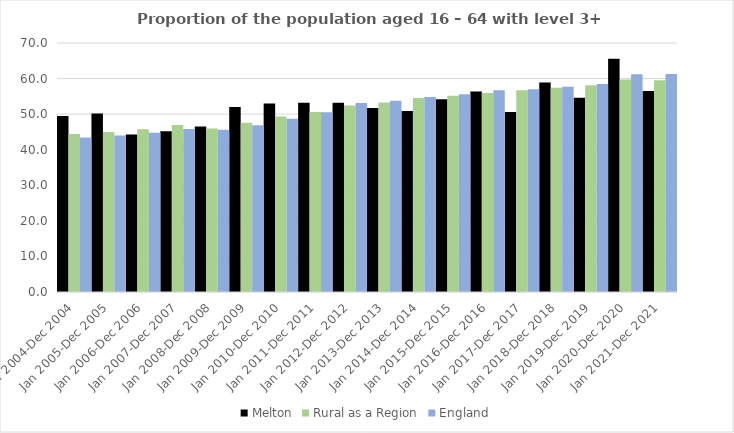
| Category | Melton | Rural as a Region | England |
|---|---|---|---|
| Jan 2004-Dec 2004 | 49.5 | 44.405 | 43.4 |
| Jan 2005-Dec 2005 | 50.2 | 44.973 | 44 |
| Jan 2006-Dec 2006 | 44.3 | 45.774 | 44.8 |
| Jan 2007-Dec 2007 | 45.2 | 46.968 | 45.8 |
| Jan 2008-Dec 2008 | 46.5 | 45.964 | 45.6 |
| Jan 2009-Dec 2009 | 52 | 47.59 | 46.9 |
| Jan 2010-Dec 2010 | 53 | 49.362 | 48.7 |
| Jan 2011-Dec 2011 | 53.2 | 50.602 | 50.5 |
| Jan 2012-Dec 2012 | 53.2 | 52.439 | 53.1 |
| Jan 2013-Dec 2013 | 51.7 | 53.276 | 53.8 |
| Jan 2014-Dec 2014 | 50.9 | 54.57 | 54.8 |
| Jan 2015-Dec 2015 | 54.2 | 55.16 | 55.6 |
| Jan 2016-Dec 2016 | 56.4 | 55.941 | 56.7 |
| Jan 2017-Dec 2017 | 50.6 | 56.689 | 57 |
| Jan 2018-Dec 2018 | 58.9 | 57.389 | 57.7 |
| Jan 2019-Dec 2019 | 54.6 | 58.147 | 58.5 |
| Jan 2020-Dec 2020 | 65.6 | 59.771 | 61.2 |
| Jan 2021-Dec 2021 | 56.5 | 59.54 | 61.3 |